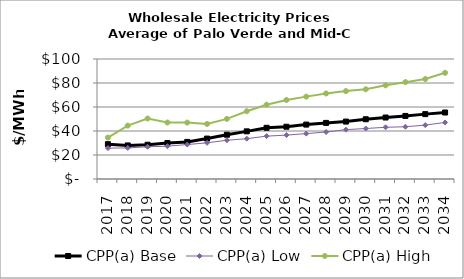
| Category | CPP(a) Base | CPP(a) Low | CPP(a) High |
|---|---|---|---|
| 2017.0 | 29.017 | 25.743 | 34.522 |
| 2018.0 | 27.981 | 25.886 | 44.488 |
| 2019.0 | 28.545 | 26.852 | 50.409 |
| 2020.0 | 30.026 | 27.334 | 47.07 |
| 2021.0 | 30.926 | 28.704 | 47.01 |
| 2022.0 | 33.678 | 30.155 | 45.883 |
| 2023.0 | 36.887 | 32.304 | 50.1 |
| 2024.0 | 39.702 | 33.593 | 56.471 |
| 2025.0 | 42.681 | 35.728 | 61.907 |
| 2026.0 | 43.545 | 36.569 | 65.818 |
| 2027.0 | 45.348 | 37.813 | 68.649 |
| 2028.0 | 46.749 | 39.16 | 71.276 |
| 2029.0 | 47.847 | 41.129 | 73.268 |
| 2030.0 | 49.796 | 42.08 | 74.762 |
| 2031.0 | 51.231 | 43.09 | 78.039 |
| 2032.0 | 52.542 | 43.553 | 80.708 |
| 2033.0 | 54.062 | 44.897 | 83.316 |
| 2034.0 | 55.412 | 47.116 | 88.488 |